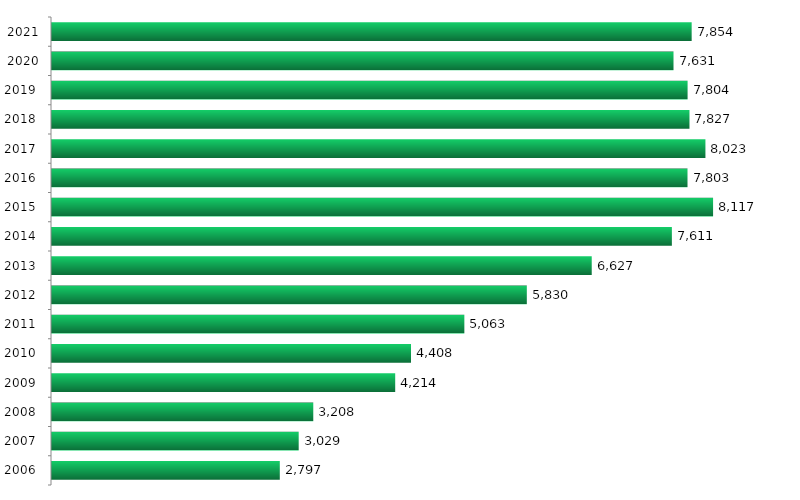
| Category | Series 0 |
|---|---|
| 2006.0 | 2797 |
| 2007.0 | 3029 |
| 2008.0 | 3208 |
| 2009.0 | 4214 |
| 2010.0 | 4408 |
| 2011.0 | 5063 |
| 2012.0 | 5830 |
| 2013.0 | 6627 |
| 2014.0 | 7611 |
| 2015.0 | 8117 |
| 2016.0 | 7803 |
| 2017.0 | 8023 |
| 2018.0 | 7827 |
| 2019.0 | 7804 |
| 2020.0 | 7631 |
| 2021.0 | 7854 |